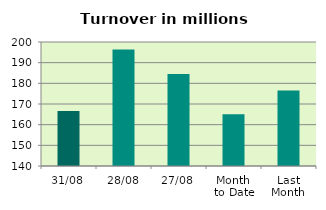
| Category | Series 0 |
|---|---|
| 31/08 | 166.58 |
| 28/08 | 196.386 |
| 27/08 | 184.501 |
| Month 
to Date | 165.075 |
| Last
Month | 176.477 |